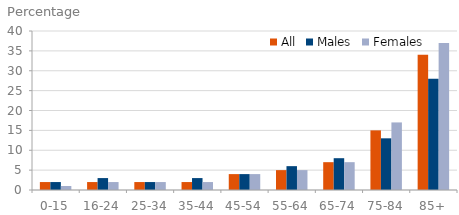
| Category | All | Males | Females |
|---|---|---|---|
| 0-15 | 2 | 2 | 1 |
| 16-24 | 2 | 3 | 2 |
| 25-34 | 2 | 2 | 2 |
| 35-44 | 2 | 3 | 2 |
| 45-54 | 4 | 4 | 4 |
| 55-64 | 5 | 6 | 5 |
| 65-74 | 7 | 8 | 7 |
| 75-84 | 15 | 13 | 17 |
| 85+ | 34 | 28 | 37 |